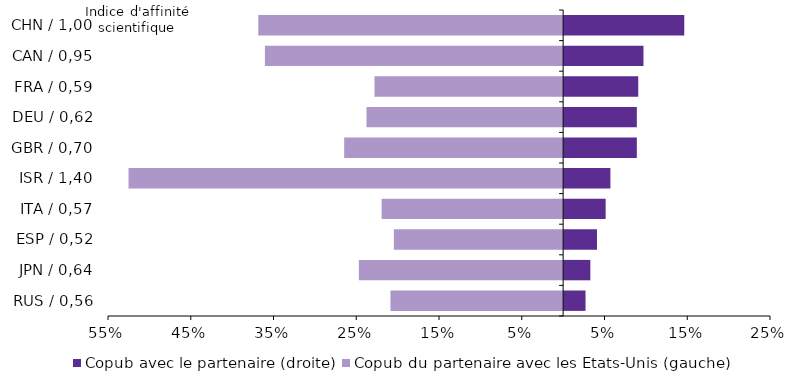
| Category | Copub avec le partenaire (droite) | Copub du partenaire avec les Etats-Unis (gauche) |
|---|---|---|
| RUS / 0,56 | 2.706 | -20.866 |
| JPN / 0,64 | 3.291 | -24.684 |
| ESP / 0,52 | 4.093 | -20.455 |
| ITA / 0,57 | 5.139 | -21.931 |
| ISR / 1,40 | 5.714 | -52.518 |
| GBR / 0,70 | 8.907 | -26.456 |
| DEU / 0,62 | 8.908 | -23.762 |
| FRA / 0,59 | 9.078 | -22.798 |
| CAN / 0,95 | 9.71 | -36.038 |
| CHN / 1,00 | 14.641 | -36.839 |